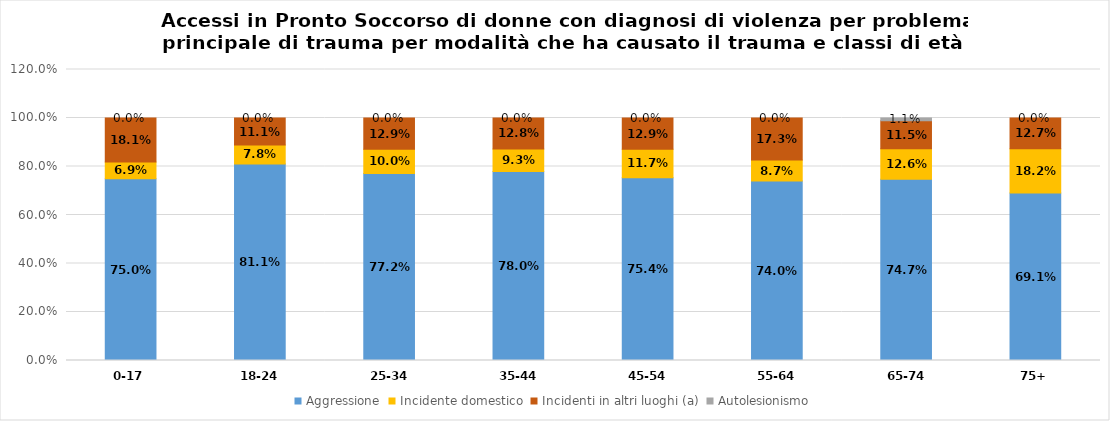
| Category | Aggressione | Incidente domestico | Incidenti in altri luoghi (a) | Autolesionismo |
|---|---|---|---|---|
| 0-17 | 0.75 | 0.069 | 0.181 | 0 |
| 18-24 | 0.811 | 0.078 | 0.111 | 0 |
| 25-34 | 0.772 | 0.1 | 0.129 | 0 |
| 35-44 | 0.78 | 0.093 | 0.128 | 0 |
| 45-54 | 0.754 | 0.117 | 0.129 | 0 |
| 55-64 | 0.74 | 0.087 | 0.173 | 0 |
| 65-74 | 0.747 | 0.126 | 0.115 | 0.011 |
| 75+ | 0.691 | 0.182 | 0.127 | 0 |